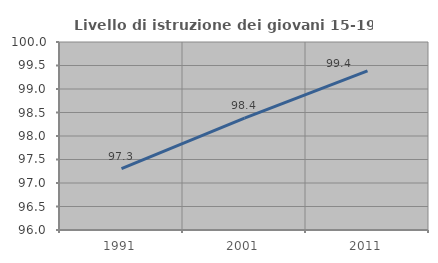
| Category | Livello di istruzione dei giovani 15-19 anni |
|---|---|
| 1991.0 | 97.308 |
| 2001.0 | 98.378 |
| 2011.0 | 99.387 |